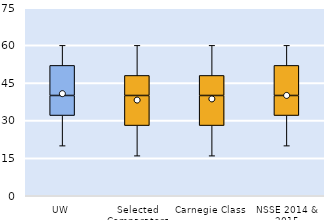
| Category | 25th | 50th | 75th |
|---|---|---|---|
| UW | 32 | 8 | 12 |
| Selected Comparators | 28 | 12 | 8 |
| Carnegie Class | 28 | 12 | 8 |
| NSSE 2014 & 2015 | 32 | 8 | 12 |